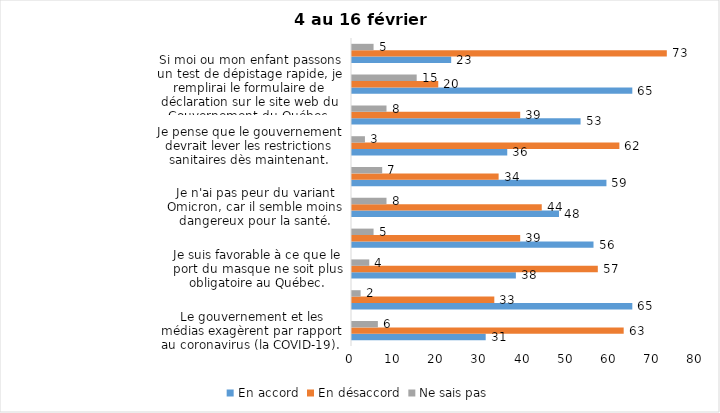
| Category | En accord | En désaccord | Ne sais pas |
|---|---|---|---|
| Le gouvernement et les médias exagèrent par rapport au coronavirus (la COVID-19). | 31 | 63 | 6 |
| Malgré la levée des mesures de confinement, je préfère limiter mes contacts avec d’autres personnes (par ex., en évitant les activités sociales et de groupes) | 65 | 33 | 2 |
| Je suis favorable à ce que le port du masque ne soit plus obligatoire au Québec. | 38 | 57 | 4 |
| Je crois que le passeport vaccinal devrait être requis pour davantage de services et commerces (ex. : spas, centre d’achats, centre de soins personnels. | 56 | 39 | 5 |
| Je n'ai pas peur du variant Omicron, car il semble moins dangereux pour la santé. | 48 | 44 | 8 |
| La vaccination obligatoire contre la COVID-19 mettrait fin à la pandémie. | 59 | 34 | 7 |
| Je pense que le gouvernement devrait lever les restrictions sanitaires dès maintenant. | 36 | 62 | 3 |
| Dans les commerces et services où le passeport vaccinal est exigé, le risque d’attraper la COVID-19 est minime. | 53 | 39 | 8 |
| Si moi ou mon enfant passons un test de dépistage rapide, je remplirai le formulaire de déclaration sur le site web du Gouvernement du Québec. | 65 | 20 | 15 |
| J’appuie les manifestations pour mettre fin aux mesures sanitaires. | 23 | 73 | 5 |